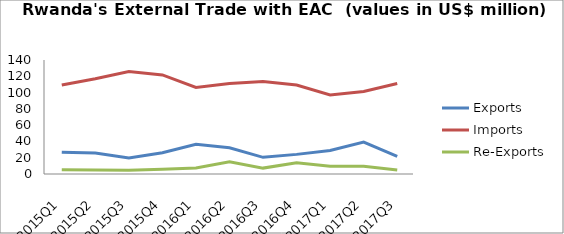
| Category | Exports | Imports | Re-Exports |
|---|---|---|---|
| 2015Q1 | 26.831 | 109.19 | 5.342 |
| 2015Q2 | 25.726 | 116.975 | 4.792 |
| 2015Q3 | 19.654 | 125.948 | 4.643 |
| 2015Q4 | 26.132 | 121.64 | 5.76 |
| 2016Q1 | 36.445 | 106.236 | 7.434 |
| 2016Q2 | 32.158 | 111.171 | 15.106 |
| 2016Q3 | 20.45 | 113.623 | 7.24 |
| 2016Q4 | 24.092 | 109.185 | 13.685 |
| 2017Q1 | 28.787 | 97.035 | 9.508 |
| 2017Q2 | 39.243 | 101.253 | 9.404 |
| 2017Q3 | 21.528 | 111.116 | 4.925 |